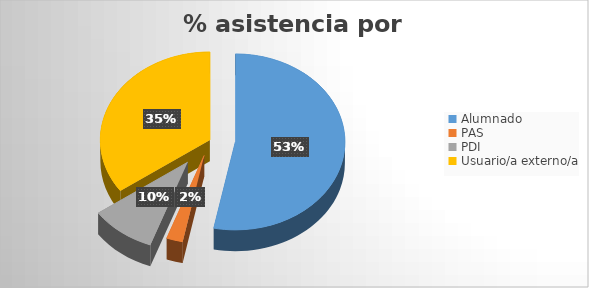
| Category | Series 0 |
|---|---|
| Alumnado | 733 |
| PAS | 33 |
| PDI | 133 |
| Usuario/a externo/a | 480 |